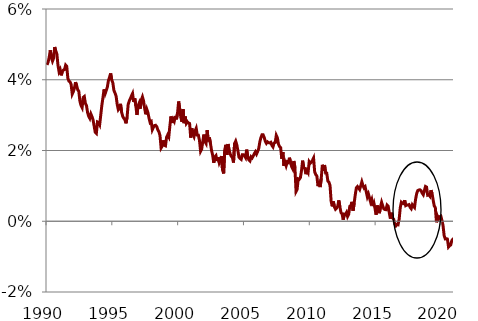
| Category | Series 0 |
|---|---|
| 1990.0 | 4.419 |
| 1990.0 | 4.498 |
| 1990.0 | 4.633 |
| 1990.0 | 4.833 |
| 1990.0 | 4.623 |
| 1990.0 | 4.526 |
| 1990.0 | 4.606 |
| 1990.0 | 4.924 |
| 1990.0 | 4.817 |
| 1990.0 | 4.727 |
| 1990.0 | 4.41 |
| 1990.0 | 4.223 |
| 1991.0 | 4.285 |
| 1991.0 | 4.124 |
| 1991.0 | 4.242 |
| 1991.0 | 4.274 |
| 1991.0 | 4.287 |
| 1991.0 | 4.415 |
| 1991.0 | 4.379 |
| 1991.0 | 4.045 |
| 1991.0 | 3.96 |
| 1991.0 | 3.94 |
| 1991.0 | 3.867 |
| 1991.0 | 3.594 |
| 1992.0 | 3.661 |
| 1992.0 | 3.765 |
| 1992.0 | 3.93 |
| 1992.0 | 3.839 |
| 1992.0 | 3.719 |
| 1992.0 | 3.673 |
| 1992.0 | 3.393 |
| 1992.0 | 3.275 |
| 1992.0 | 3.212 |
| 1992.0 | 3.501 |
| 1992.0 | 3.527 |
| 1992.0 | 3.334 |
| 1993.0 | 3.271 |
| 1993.0 | 3.073 |
| 1993.0 | 2.968 |
| 1993.0 | 2.909 |
| 1993.0 | 3.034 |
| 1993.0 | 2.96 |
| 1993.0 | 2.864 |
| 1993.0 | 2.687 |
| 1993.0 | 2.513 |
| 1993.0 | 2.483 |
| 1993.0 | 2.806 |
| 1993.0 | 2.789 |
| 1994.0 | 2.728 |
| 1994.0 | 3.002 |
| 1994.0 | 3.28 |
| 1994.0 | 3.494 |
| 1994.0 | 3.729 |
| 1994.0 | 3.607 |
| 1994.0 | 3.697 |
| 1994.0 | 3.793 |
| 1994.0 | 3.98 |
| 1994.0 | 4.071 |
| 1994.0 | 4.18 |
| 1994.0 | 3.995 |
| 1995.0 | 3.913 |
| 1995.0 | 3.701 |
| 1995.0 | 3.624 |
| 1995.0 | 3.537 |
| 1995.0 | 3.3 |
| 1995.0 | 3.155 |
| 1995.0 | 3.198 |
| 1995.0 | 3.319 |
| 1995.0 | 3.082 |
| 1995.0 | 2.969 |
| 1995.0 | 2.909 |
| 1995.0 | 2.873 |
| 1996.0 | 2.769 |
| 1996.0 | 2.943 |
| 1996.0 | 3.307 |
| 1996.0 | 3.4 |
| 1996.0 | 3.468 |
| 1996.0 | 3.545 |
| 1996.0 | 3.611 |
| 1996.0 | 3.376 |
| 1996.0 | 3.478 |
| 1996.0 | 3.256 |
| 1996.0 | 3.005 |
| 1996.0 | 3.259 |
| 1997.0 | 3.338 |
| 1997.0 | 3.183 |
| 1997.0 | 3.432 |
| 1997.0 | 3.517 |
| 1997.0 | 3.405 |
| 1997.0 | 3.194 |
| 1997.0 | 3.023 |
| 1997.0 | 3.162 |
| 1997.0 | 3.07 |
| 1997.0 | 2.916 |
| 1997.0 | 2.79 |
| 1997.0 | 2.816 |
| 1998.0 | 2.588 |
| 1998.0 | 2.656 |
| 1998.0 | 2.705 |
| 1998.0 | 2.713 |
| 1998.0 | 2.676 |
| 1998.0 | 2.584 |
| 1998.0 | 2.532 |
| 1998.0 | 2.425 |
| 1998.0 | 2.071 |
| 1998.0 | 2.123 |
| 1998.0 | 2.286 |
| 1998.0 | 2.148 |
| 1999.0 | 2.133 |
| 1999.0 | 2.375 |
| 1999.0 | 2.441 |
| 1999.0 | 2.384 |
| 1999.0 | 2.691 |
| 1999.0 | 2.963 |
| 1999.0 | 2.779 |
| 1999.0 | 2.884 |
| 1999.0 | 2.826 |
| 1999.0 | 2.975 |
| 1999.0 | 2.881 |
| 1999.0 | 3.063 |
| 2000.0 | 3.386 |
| 2000.0 | 3.171 |
| 2000.0 | 2.931 |
| 2000.0 | 2.812 |
| 2000.0 | 3.168 |
| 2000.0 | 2.774 |
| 2000.0 | 2.961 |
| 2000.0 | 2.765 |
| 2000.0 | 2.811 |
| 2000.0 | 2.779 |
| 2000.0 | 2.764 |
| 2000.0 | 2.364 |
| 2001.0 | 2.627 |
| 2001.0 | 2.458 |
| 2001.0 | 2.391 |
| 2001.0 | 2.553 |
| 2001.0 | 2.628 |
| 2001.0 | 2.435 |
| 2001.0 | 2.433 |
| 2001.0 | 2.284 |
| 2001.0 | 1.981 |
| 2001.0 | 2.042 |
| 2001.0 | 2.253 |
| 2001.0 | 2.451 |
| 2002.0 | 2.25 |
| 2002.0 | 2.198 |
| 2002.0 | 2.575 |
| 2002.0 | 2.258 |
| 2002.0 | 2.367 |
| 2002.0 | 2.2 |
| 2002.0 | 2.003 |
| 2002.0 | 1.867 |
| 2002.0 | 1.652 |
| 2002.0 | 1.82 |
| 2002.0 | 1.856 |
| 2002.0 | 1.703 |
| 2003.0 | 1.806 |
| 2003.0 | 1.654 |
| 2003.0 | 1.732 |
| 2003.0 | 1.843 |
| 2003.0 | 1.453 |
| 2003.0 | 1.351 |
| 2003.0 | 2.007 |
| 2003.0 | 2.161 |
| 2003.0 | 1.873 |
| 2003.0 | 2.184 |
| 2003.0 | 2.009 |
| 2003.0 | 1.905 |
| 2004.0 | 1.833 |
| 2004.0 | 1.805 |
| 2004.0 | 1.658 |
| 2004.0 | 2.202 |
| 2004.0 | 2.265 |
| 2004.0 | 2.163 |
| 2004.0 | 1.998 |
| 2004.0 | 1.808 |
| 2004.0 | 1.774 |
| 2004.0 | 1.749 |
| 2004.0 | 1.883 |
| 2004.0 | 1.883 |
| 2005.0 | 1.851 |
| 2005.0 | 1.799 |
| 2005.0 | 2.025 |
| 2005.0 | 1.818 |
| 2005.0 | 1.736 |
| 2005.0 | 1.705 |
| 2005.0 | 1.82 |
| 2005.0 | 1.789 |
| 2005.0 | 1.846 |
| 2005.0 | 1.911 |
| 2005.0 | 1.964 |
| 2005.0 | 1.9 |
| 2006.0 | 1.971 |
| 2006.0 | 2.056 |
| 2006.0 | 2.246 |
| 2006.0 | 2.364 |
| 2006.0 | 2.446 |
| 2006.0 | 2.444 |
| 2006.0 | 2.368 |
| 2006.0 | 2.261 |
| 2006.0 | 2.203 |
| 2006.0 | 2.244 |
| 2006.0 | 2.221 |
| 2006.0 | 2.213 |
| 2007.0 | 2.231 |
| 2007.0 | 2.144 |
| 2007.0 | 2.101 |
| 2007.0 | 2.211 |
| 2007.0 | 2.226 |
| 2007.0 | 2.428 |
| 2007.0 | 2.36 |
| 2007.0 | 2.18 |
| 2007.0 | 2.108 |
| 2007.0 | 2.078 |
| 2007.0 | 1.766 |
| 2007.0 | 1.953 |
| 2008.0 | 1.565 |
| 2008.0 | 1.667 |
| 2008.0 | 1.569 |
| 2008.0 | 1.679 |
| 2008.0 | 1.66 |
| 2008.0 | 1.797 |
| 2008.0 | 1.667 |
| 2008.0 | 1.543 |
| 2008.0 | 1.48 |
| 2008.0 | 1.703 |
| 2008.0 | 1.523 |
| 2008.0 | 0.839 |
| 2009.0 | 0.899 |
| 2009.0 | 1.2 |
| 2009.0 | 1.187 |
| 2009.0 | 1.234 |
| 2009.0 | 1.433 |
| 2009.0 | 1.713 |
| 2009.0 | 1.518 |
| 2009.0 | 1.497 |
| 2009.0 | 1.331 |
| 2009.0 | 1.434 |
| 2009.0 | 1.377 |
| 2009.0 | 1.684 |
| 2010.0 | 1.639 |
| 2010.0 | 1.673 |
| 2010.0 | 1.723 |
| 2010.0 | 1.787 |
| 2010.0 | 1.397 |
| 2010.0 | 1.319 |
| 2010.0 | 1.28 |
| 2010.0 | 0.991 |
| 2010.0 | 1.069 |
| 2010.0 | 0.966 |
| 2010.0 | 1.214 |
| 2010.0 | 1.595 |
| 2011.0 | 1.423 |
| 2011.0 | 1.59 |
| 2011.0 | 1.362 |
| 2011.0 | 1.361 |
| 2011.0 | 1.138 |
| 2011.0 | 1.106 |
| 2011.0 | 1.011 |
| 2011.0 | 0.569 |
| 2011.0 | 0.422 |
| 2011.0 | 0.562 |
| 2011.0 | 0.401 |
| 2011.0 | 0.338 |
| 2012.0 | 0.369 |
| 2012.0 | 0.424 |
| 2012.0 | 0.59 |
| 2012.0 | 0.4 |
| 2012.0 | 0.245 |
| 2012.0 | 0.204 |
| 2012.0 | 0.045 |
| 2012.0 | 0.2 |
| 2012.0 | 0.191 |
| 2012.0 | 0.247 |
| 2012.0 | 0.132 |
| 2012.0 | 0.194 |
| 2013.0 | 0.421 |
| 2013.0 | 0.442 |
| 2013.0 | 0.548 |
| 2013.0 | 0.298 |
| 2013.0 | 0.516 |
| 2013.0 | 0.75 |
| 2013.0 | 0.945 |
| 2013.0 | 0.982 |
| 2013.0 | 0.941 |
| 2013.0 | 0.895 |
| 2013.0 | 1.004 |
| 2013.0 | 1.115 |
| 2014.0 | 1.011 |
| 2014.0 | 0.941 |
| 2014.0 | 0.975 |
| 2014.0 | 0.835 |
| 2014.0 | 0.691 |
| 2014.0 | 0.77 |
| 2014.0 | 0.658 |
| 2014.0 | 0.541 |
| 2014.0 | 0.617 |
| 2014.0 | 0.427 |
| 2014.0 | 0.514 |
| 2014.0 | 0.358 |
| 2015.0 | 0.186 |
| 2015.0 | 0.446 |
| 2015.0 | 0.337 |
| 2015.0 | 0.228 |
| 2015.0 | 0.406 |
| 2015.0 | 0.536 |
| 2015.0 | 0.437 |
| 2015.0 | 0.352 |
| 2015.0 | 0.331 |
| 2015.0 | 0.327 |
| 2015.0 | 0.457 |
| 2015.0 | 0.427 |
| 2016.0 | 0.24 |
| 2016.0 | 0.073 |
| 2016.0 | 0.241 |
| 2016.0 | 0.094 |
| 2016.0 | 0.061 |
| 2016.0 | -0.084 |
| 2016.0 | -0.13 |
| 2016.0 | -0.088 |
| 2016.0 | -0.098 |
| 2016.0 | 0.055 |
| 2016.0 | 0.382 |
| 2016.0 | 0.536 |
| 2017.0 | 0.508 |
| 2017.0 | 0.498 |
| 2017.0 | 0.593 |
| 2017.0 | 0.442 |
| 2017.0 | 0.459 |
| 2017.0 | 0.46 |
| 2017.0 | 0.47 |
| 2017.0 | 0.395 |
| 2017.0 | 0.356 |
| 2017.0 | 0.467 |
| 2017.0 | 0.425 |
| 2017.0 | 0.389 |
| 2018.0 | 0.624 |
| 2018.0 | 0.787 |
| 2018.0 | 0.87 |
| 2018.0 | 0.886 |
| 2018.0 | 0.888 |
| 2018.0 | 0.864 |
| 2018.0 | 0.794 |
| 2018.0 | 0.75 |
| 2018.0 | 0.864 |
| 2018.0 | 0.983 |
| 2018.0 | 0.966 |
| 2018.0 | 0.739 |
| 2019.0 | 0.752 |
| 2019.0 | 0.709 |
| 2019.0 | 0.878 |
| 2019.0 | 0.783 |
| 2019.0 | 0.597 |
| 2019.0 | 0.433 |
| 2019.0 | 0.384 |
| 2019.0 | -0.029 |
| 2019.0 | 0.14 |
| 2019.0 | 0.068 |
| 2019.0 | 0.131 |
| 2019.0 | 0.145 |
| 2020.0 | 0.025 |
| 2020.0 | -0.119 |
| 2020.0 | -0.4 |
| 2020.0 | -0.498 |
| 2020.0 | -0.492 |
| 2020.0 | -0.502 |
| 2020.0 | -0.727 |
| 2020.0 | -0.691 |
| 2020.0 | -0.671 |
| 2020.0 | -0.548 |
| 2020.0 | -0.507 |
| 2020.0 | -0.48 |